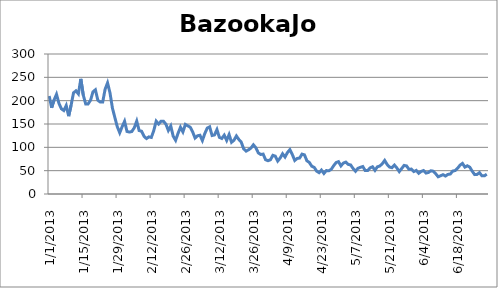
| Category | BazookaJoe |
|---|---|
| 1/1/13 | 210 |
| 1/2/13 | 184.8 |
| 1/3/13 | 201.4 |
| 1/4/13 | 213.5 |
| 1/5/13 | 194.3 |
| 1/6/13 | 182.6 |
| 1/7/13 | 178.9 |
| 1/8/13 | 189.6 |
| 1/9/13 | 166.8 |
| 1/10/13 | 190.2 |
| 1/11/13 | 216.8 |
| 1/12/13 | 221.1 |
| 1/13/13 | 214.5 |
| 1/14/13 | 246.7 |
| 1/15/13 | 212.2 |
| 1/16/13 | 193.1 |
| 1/17/13 | 193.1 |
| 1/18/13 | 200.8 |
| 1/19/13 | 218.9 |
| 1/20/13 | 223.3 |
| 1/21/13 | 201 |
| 1/22/13 | 197 |
| 1/23/13 | 197 |
| 1/24/13 | 224.6 |
| 1/25/13 | 238.1 |
| 1/26/13 | 216.7 |
| 1/27/13 | 184.2 |
| 1/28/13 | 163.9 |
| 1/29/13 | 144.2 |
| 1/30/13 | 131.2 |
| 1/31/13 | 144.3 |
| 2/1/13 | 155.8 |
| 2/2/13 | 134 |
| 2/3/13 | 132.7 |
| 2/4/13 | 134 |
| 2/5/13 | 142 |
| 2/6/13 | 156.2 |
| 2/7/13 | 135.9 |
| 2/8/13 | 134.5 |
| 2/9/13 | 123.7 |
| 2/10/13 | 118.8 |
| 2/11/13 | 122.4 |
| 2/12/13 | 121.2 |
| 2/13/13 | 135.7 |
| 2/14/13 | 156.1 |
| 2/15/13 | 149.9 |
| 2/16/13 | 155.9 |
| 2/17/13 | 155.9 |
| 2/18/13 | 149.7 |
| 2/19/13 | 136.2 |
| 2/20/13 | 145.7 |
| 2/21/13 | 123.8 |
| 2/22/13 | 115.1 |
| 2/23/13 | 130.1 |
| 2/24/13 | 143.1 |
| 2/25/13 | 133.1 |
| 2/26/13 | 149.1 |
| 2/27/13 | 146.1 |
| 2/28/13 | 143.2 |
| 3/1/13 | 133.2 |
| 3/2/13 | 119.9 |
| 3/3/13 | 124.7 |
| 3/4/13 | 125.9 |
| 3/5/13 | 114.6 |
| 3/6/13 | 129.5 |
| 3/7/13 | 141.2 |
| 3/8/13 | 144 |
| 3/9/13 | 125.3 |
| 3/10/13 | 126.6 |
| 3/11/13 | 138 |
| 3/12/13 | 121.4 |
| 3/13/13 | 119 |
| 3/14/13 | 126.1 |
| 3/15/13 | 114.8 |
| 3/16/13 | 127.4 |
| 3/17/13 | 110.8 |
| 3/18/13 | 115.2 |
| 3/19/13 | 124.4 |
| 3/20/13 | 116.9 |
| 3/21/13 | 111.1 |
| 3/22/13 | 96.7 |
| 3/23/13 | 91.9 |
| 3/24/13 | 94.7 |
| 3/25/13 | 98.5 |
| 3/26/13 | 105.4 |
| 3/27/13 | 99.1 |
| 3/28/13 | 88.2 |
| 3/29/13 | 84.7 |
| 3/30/13 | 85.5 |
| 3/31/13 | 73.5 |
| 4/1/13 | 71.3 |
| 4/2/13 | 73.4 |
| 4/3/13 | 82.9 |
| 4/4/13 | 81.2 |
| 4/5/13 | 70.6 |
| 4/6/13 | 77 |
| 4/7/13 | 86.2 |
| 4/8/13 | 79.3 |
| 4/9/13 | 88.8 |
| 4/10/13 | 95 |
| 4/11/13 | 84.6 |
| 4/12/13 | 71.9 |
| 4/13/13 | 76.2 |
| 4/14/13 | 77 |
| 4/15/13 | 85.5 |
| 4/16/13 | 83.8 |
| 4/17/13 | 71.2 |
| 4/18/13 | 67.6 |
| 4/19/13 | 59.5 |
| 4/20/13 | 57.1 |
| 4/21/13 | 49.1 |
| 4/22/13 | 45.7 |
| 4/23/13 | 51.2 |
| 4/24/13 | 44 |
| 4/25/13 | 50.2 |
| 4/26/13 | 49.7 |
| 4/27/13 | 52.7 |
| 4/28/13 | 60.6 |
| 4/29/13 | 67.3 |
| 4/30/13 | 69.3 |
| 5/1/13 | 60.3 |
| 5/2/13 | 66.3 |
| 5/3/13 | 68.3 |
| 5/4/13 | 63.5 |
| 5/5/13 | 62.2 |
| 5/6/13 | 54.7 |
| 5/7/13 | 48.7 |
| 5/8/13 | 55 |
| 5/9/13 | 57.2 |
| 5/10/13 | 58.9 |
| 5/11/13 | 50.1 |
| 5/12/13 | 50.1 |
| 5/13/13 | 56.1 |
| 5/14/13 | 58.3 |
| 5/15/13 | 50.7 |
| 5/16/13 | 58.3 |
| 5/17/13 | 60 |
| 5/18/13 | 64.8 |
| 5/19/13 | 71.9 |
| 5/20/13 | 63.3 |
| 5/21/13 | 57.6 |
| 5/22/13 | 56.4 |
| 5/23/13 | 62 |
| 5/24/13 | 55.8 |
| 5/25/13 | 48 |
| 5/26/13 | 54.7 |
| 5/27/13 | 61.3 |
| 5/28/13 | 60.1 |
| 5/29/13 | 52.9 |
| 5/30/13 | 53.4 |
| 5/31/13 | 48.1 |
| 6/1/13 | 50.5 |
| 6/2/13 | 44.4 |
| 6/3/13 | 48.4 |
| 6/4/13 | 50.3 |
| 6/5/13 | 44.8 |
| 6/6/13 | 46.1 |
| 6/7/13 | 49.8 |
| 6/8/13 | 48.8 |
| 6/9/13 | 43.4 |
| 6/10/13 | 36.9 |
| 6/11/13 | 39.1 |
| 6/12/13 | 41.4 |
| 6/13/13 | 38.5 |
| 6/14/13 | 42 |
| 6/15/13 | 42.8 |
| 6/16/13 | 49.2 |
| 6/17/13 | 50.2 |
| 6/18/13 | 55.2 |
| 6/19/13 | 61.8 |
| 6/20/13 | 65.5 |
| 6/21/13 | 57.6 |
| 6/22/13 | 60.5 |
| 6/23/13 | 57.5 |
| 6/24/13 | 48.9 |
| 6/25/13 | 41.6 |
| 6/26/13 | 42 |
| 6/27/13 | 45.8 |
| 6/28/13 | 38.9 |
| 6/29/13 | 38.9 |
| 6/30/13 | 42.4 |